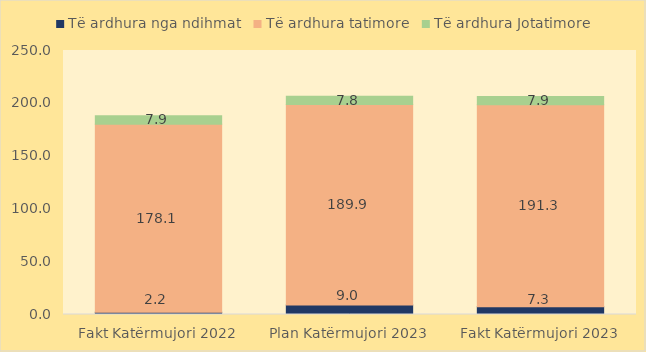
| Category | Të ardhura nga ndihmat | Të ardhura tatimore | Të ardhura Jotatimore |
|---|---|---|---|
| Fakt Katërmujori 2022 | 2.167 | 178.083 | 7.909 |
| Plan Katërmujori 2023 | 9.005 | 189.92 | 7.753 |
| Fakt Katërmujori 2023 | 7.345 | 191.289 | 7.863 |